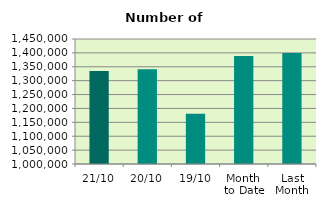
| Category | Series 0 |
|---|---|
| 21/10 | 1335030 |
| 20/10 | 1341062 |
| 19/10 | 1180846 |
| Month 
to Date | 1389193.733 |
| Last
Month | 1399299.909 |